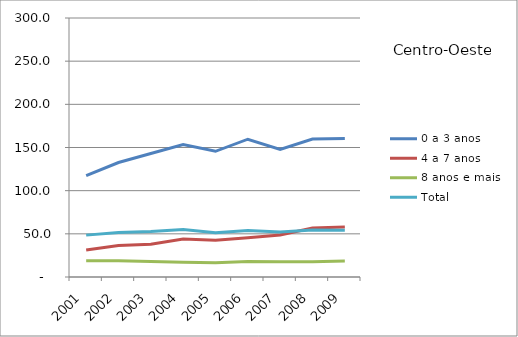
| Category | 0 a 3 anos | 4 a 7 anos | 8 anos e mais | Total |
|---|---|---|---|---|
| 2001.0 | 117.5 | 31.4 | 18.8 | 48.5 |
| 2002.0 | 132.6 | 36.6 | 18.9 | 51.5 |
| 2003.0 | 143 | 37.9 | 18 | 52.6 |
| 2004.0 | 153.4 | 44.1 | 17.1 | 54.9 |
| 2005.0 | 145.6 | 42.5 | 16.5 | 51.4 |
| 2006.0 | 159.6 | 45.6 | 18 | 54 |
| 2007.0 | 147.7 | 48.6 | 17.6 | 52.1 |
| 2008.0 | 159.9 | 56.8 | 17.7 | 54.5 |
| 2009.0 | 160.4 | 58 | 18.4 | 54.2 |